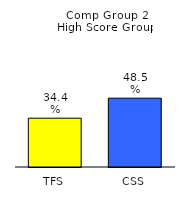
| Category | Series 0 |
|---|---|
| TFS | 0.344 |
| CSS | 0.485 |